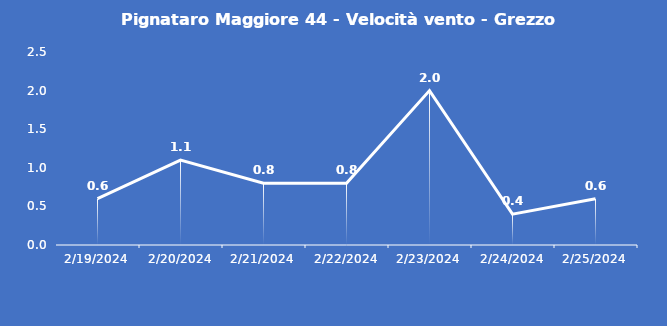
| Category | Pignataro Maggiore 44 - Velocità vento - Grezzo (m/s) |
|---|---|
| 2/19/24 | 0.6 |
| 2/20/24 | 1.1 |
| 2/21/24 | 0.8 |
| 2/22/24 | 0.8 |
| 2/23/24 | 2 |
| 2/24/24 | 0.4 |
| 2/25/24 | 0.6 |